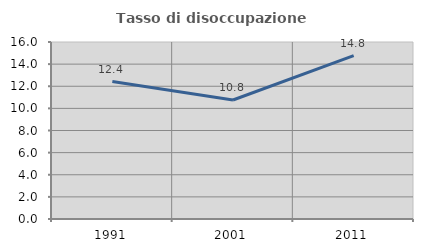
| Category | Tasso di disoccupazione giovanile  |
|---|---|
| 1991.0 | 12.428 |
| 2001.0 | 10.757 |
| 2011.0 | 14.773 |